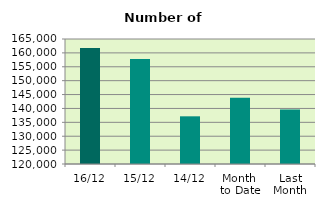
| Category | Series 0 |
|---|---|
| 16/12 | 161774 |
| 15/12 | 157774 |
| 14/12 | 137166 |
| Month 
to Date | 143856.333 |
| Last
Month | 139642.182 |